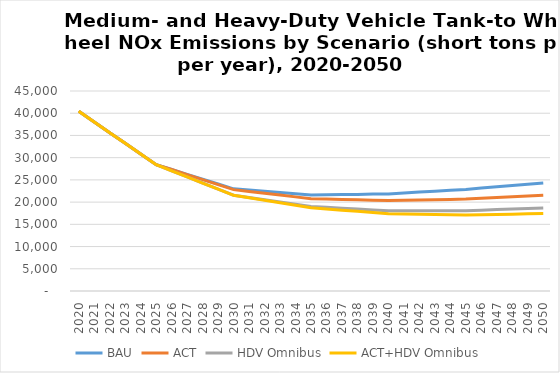
| Category | BAU | ACT | HDV Omnibus | ACT+HDV Omnibus |
|---|---|---|---|---|
| 2020.0 | 40420 | 40420 | 40420 | 40420 |
| 2021.0 | 38020 | 38020 | 38020 | 38020 |
| 2022.0 | 35620 | 35620 | 35620 | 35620 |
| 2023.0 | 33220 | 33220 | 33220 | 33220 |
| 2024.0 | 30820 | 30820 | 30820 | 30820 |
| 2025.0 | 28420 | 28420 | 28420 | 28420 |
| 2026.0 | 27330 | 27330 | 27050 | 27050 |
| 2027.0 | 26240 | 26200 | 25670 | 25670 |
| 2028.0 | 25160 | 25070 | 24300 | 24290 |
| 2029.0 | 24070 | 23940 | 22920 | 22900 |
| 2030.0 | 22980 | 22810 | 21550 | 21520 |
| 2031.0 | 22700 | 22400 | 21050 | 20960 |
| 2032.0 | 22420 | 21990 | 20540 | 20400 |
| 2033.0 | 22140 | 21590 | 20040 | 19840 |
| 2034.0 | 21860 | 21180 | 19530 | 19280 |
| 2035.0 | 21580 | 20770 | 19030 | 18720 |
| 2036.0 | 21630 | 20680 | 18830 | 18460 |
| 2037.0 | 21690 | 20600 | 18630 | 18190 |
| 2038.0 | 21740 | 20510 | 18430 | 17930 |
| 2039.0 | 21800 | 20430 | 18230 | 17660 |
| 2040.0 | 21850 | 20340 | 18030 | 17400 |
| 2041.0 | 22050 | 20410 | 18040 | 17340 |
| 2042.0 | 22250 | 20480 | 18040 | 17280 |
| 2043.0 | 22460 | 20540 | 18050 | 17210 |
| 2044.0 | 22660 | 20610 | 18050 | 17150 |
| 2045.0 | 22860 | 20680 | 18060 | 17090 |
| 2046.0 | 23150 | 20860 | 18180 | 17160 |
| 2047.0 | 23440 | 21030 | 18310 | 17230 |
| 2048.0 | 23720 | 21210 | 18430 | 17290 |
| 2049.0 | 24010 | 21380 | 18560 | 17360 |
| 2050.0 | 24300 | 21560 | 18680 | 17430 |